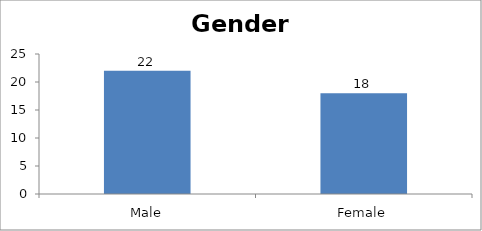
| Category | Gender |
|---|---|
| Male | 22 |
| Female | 18 |